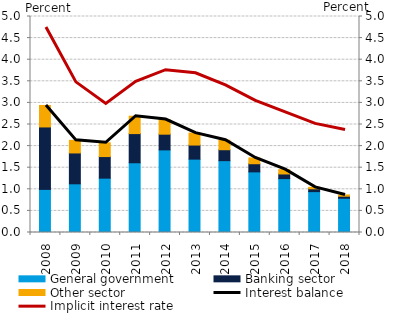
| Category | General government | Banking sector | Other sector |
|---|---|---|---|
| 0 | 0.998 | 1.445 | 0.497 |
| 1 | 1.127 | 0.714 | 0.292 |
| 2 | 1.258 | 0.5 | 0.319 |
| 3 | 1.614 | 0.676 | 0.402 |
| 4 | 1.912 | 0.364 | 0.338 |
| 5 | 1.698 | 0.326 | 0.277 |
| 6 | 1.663 | 0.253 | 0.22 |
| 7 | 1.404 | 0.188 | 0.134 |
| 8 | 1.247 | 0.108 | 0.1 |
| 9 | 0.946 | 0.065 | 0.034 |
| 10 | 0.792 | 0.048 | 0.029 |